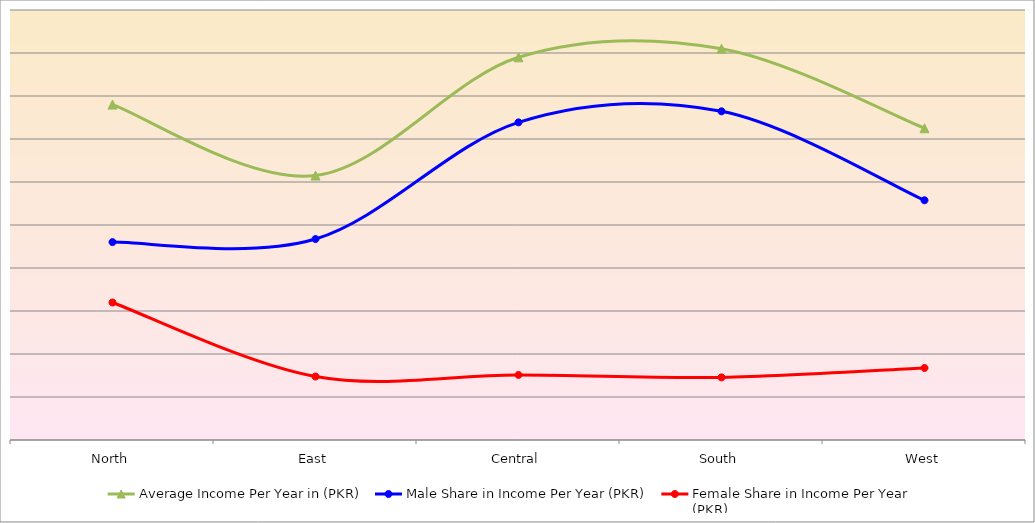
| Category | Average Income Per Year in (PKR) | Male Share in Income Per Year (PKR) | Female Share in Income Per Year
(PKR) |
|---|---|---|---|
| North | 156000 | 92040 | 63960 |
| East | 123000 | 93480 | 29520 |
| Central | 178000 | 147740 | 30260 |
| South | 182000 | 152880 | 29120 |
| West | 145000 | 111505 | 33495 |